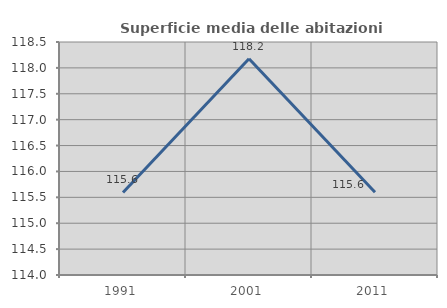
| Category | Superficie media delle abitazioni occupate |
|---|---|
| 1991.0 | 115.595 |
| 2001.0 | 118.177 |
| 2011.0 | 115.597 |